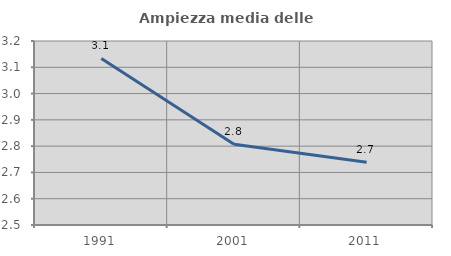
| Category | Ampiezza media delle famiglie |
|---|---|
| 1991.0 | 3.134 |
| 2001.0 | 2.807 |
| 2011.0 | 2.739 |